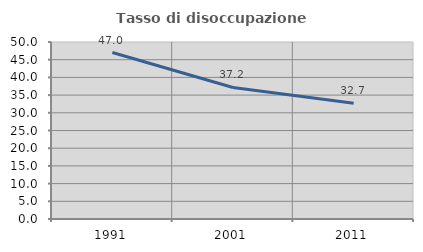
| Category | Tasso di disoccupazione giovanile  |
|---|---|
| 1991.0 | 47.031 |
| 2001.0 | 37.154 |
| 2011.0 | 32.718 |